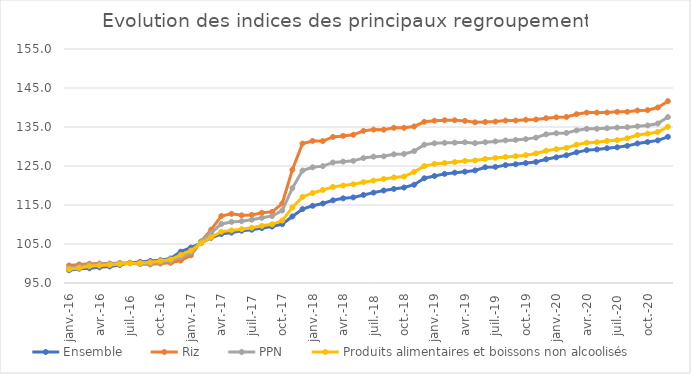
| Category |  Ensemble  |  Riz  |  PPN  |  Produits alimentaires et boissons non alcoolisés  |
|---|---|---|---|---|
| 2016-01-01 | 98.275 | 99.495 | 98.861 | 98.497 |
| 2016-02-01 | 98.669 | 99.754 | 99.183 | 98.836 |
| 2016-03-01 | 98.78 | 99.934 | 99.647 | 99.278 |
| 2016-04-01 | 99.017 | 99.994 | 99.867 | 99.476 |
| 2016-05-01 | 99.242 | 99.991 | 99.897 | 99.634 |
| 2016-06-01 | 99.614 | 100.144 | 100.021 | 99.851 |
| 2016-07-01 | 100.2 | 100.14 | 100.04 | 100.066 |
| 2016-08-01 | 100.412 | 99.904 | 99.904 | 100.159 |
| 2016-09-01 | 100.639 | 99.746 | 99.918 | 100.312 |
| 2016-10-01 | 100.848 | 99.979 | 100.318 | 100.675 |
| 2016-11-01 | 101.278 | 100.17 | 100.701 | 101.025 |
| 2016-12-01 | 103.026 | 100.747 | 101.643 | 102.191 |
| 2017-01-01 | 104.075 | 102.088 | 102.766 | 103.319 |
| 2017-02-01 | 105.227 | 105.671 | 105.604 | 105.201 |
| 2017-03-01 | 106.597 | 108.676 | 107.857 | 106.739 |
| 2017-04-01 | 107.562 | 112.176 | 110.14 | 108.143 |
| 2017-05-01 | 107.914 | 112.738 | 110.659 | 108.491 |
| 2017-06-01 | 108.397 | 112.351 | 110.843 | 108.798 |
| 2017-07-01 | 108.659 | 112.464 | 111.234 | 109.178 |
| 2017-08-01 | 109.085 | 113.002 | 111.719 | 109.659 |
| 2017-09-01 | 109.466 | 113.231 | 112.163 | 110.039 |
| 2017-10-01 | 110.085 | 115.374 | 113.583 | 111.008 |
| 2017-11-01 | 112.067 | 124.042 | 119.334 | 114.381 |
| 2017-12-01 | 113.945 | 130.752 | 123.824 | 117.072 |
| 2018-01-01 | 114.792 | 131.429 | 124.677 | 118.083 |
| 2018-02-01 | 115.382 | 131.39 | 124.962 | 118.86 |
| 2018-03-01 | 116.197 | 132.45 | 125.908 | 119.648 |
| 2018-04-01 | 116.708 | 132.716 | 126.112 | 119.992 |
| 2018-05-01 | 116.945 | 133.005 | 126.317 | 120.318 |
| 2018-06-01 | 117.574 | 134.006 | 127.039 | 120.852 |
| 2018-07-01 | 118.169 | 134.333 | 127.399 | 121.251 |
| 2018-08-01 | 118.716 | 134.315 | 127.482 | 121.67 |
| 2018-09-01 | 119.112 | 134.797 | 128.002 | 122.064 |
| 2018-10-01 | 119.471 | 134.79 | 128.09 | 122.277 |
| 2018-11-01 | 120.196 | 135.136 | 128.817 | 123.5 |
| 2018-12-01 | 121.856 | 136.326 | 130.448 | 124.972 |
| 2019-01-01 | 122.431 | 136.617 | 130.824 | 125.539 |
| 2019-02-01 | 122.976 | 136.743 | 130.947 | 125.775 |
| 2019-03-01 | 123.287 | 136.724 | 130.988 | 126.003 |
| 2019-04-01 | 123.539 | 136.57 | 131.08 | 126.288 |
| 2019-05-01 | 123.87 | 136.199 | 130.864 | 126.405 |
| 2019-06-01 | 124.678 | 136.285 | 131.1 | 126.791 |
| 2019-07-01 | 124.773 | 136.384 | 131.306 | 127.081 |
| 2019-08-01 | 125.224 | 136.653 | 131.568 | 127.335 |
| 2019-09-01 | 125.442 | 136.653 | 131.684 | 127.515 |
| 2019-10-01 | 125.743 | 136.854 | 131.892 | 127.783 |
| 2019-11-01 | 126.03 | 136.915 | 132.269 | 128.209 |
| 2019-12-01 | 126.732 | 137.262 | 133.132 | 128.908 |
| 2020-01-01 | 127.22 | 137.477 | 133.394 | 129.324 |
| 2020-02-01 | 127.747 | 137.571 | 133.482 | 129.658 |
| 2020-03-01 | 128.503 | 138.279 | 134.127 | 130.477 |
| 2020-04-01 | 129.073 | 138.691 | 134.528 | 130.962 |
| 2020-05-01 | 129.246 | 138.695 | 134.553 | 131.1 |
| 2020-06-01 | 129.569 | 138.715 | 134.691 | 131.433 |
| 2020-07-01 | 129.792 | 138.884 | 134.842 | 131.639 |
| 2020-08-01 | 130.165 | 138.908 | 134.939 | 132.108 |
| 2020-09-01 | 130.779 | 139.227 | 135.17 | 132.94 |
| 2020-10-01 | 131.152 | 139.307 | 135.396 | 133.293 |
| 2020-11-01 | 131.562 | 139.996 | 135.904 | 133.717 |
| 2020-12-01 | 132.488 | 141.627 | 137.548 | 135.07 |